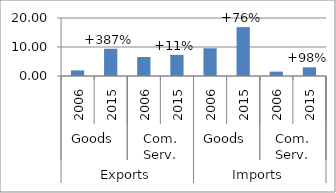
| Category | Trade flows |
|---|---|
| 0 | 1.931 |
| 1 | 9.398 |
| 2 | 6.56 |
| 3 | 7.267 |
| 4 | 9.559 |
| 5 | 16.863 |
| 6 | 1.51 |
| 7 | 2.994 |